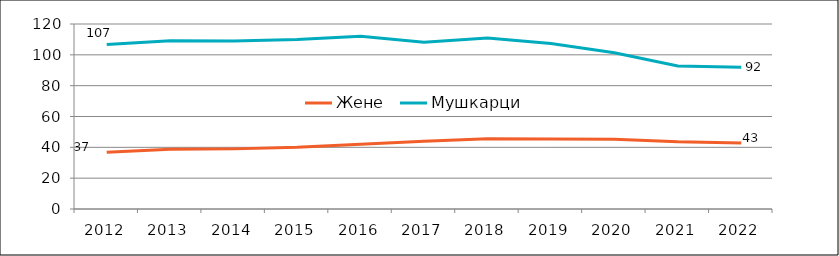
| Category | Жене | Мушкарци |
|---|---|---|
| 2012.0 | 36.769 | 106.712 |
| 2013.0 | 38.687 | 109.131 |
| 2014.0 | 39 | 109 |
| 2015.0 | 40 | 110 |
| 2016.0 | 42 | 112 |
| 2017.0 | 43.876 | 108.222 |
| 2018.0 | 45.547 | 110.856 |
| 2019.0 | 45.458 | 107.278 |
| 2020.0 | 45.298 | 101.39 |
| 2021.0 | 43.594 | 92.756 |
| 2022.0 | 42.82 | 92.014 |